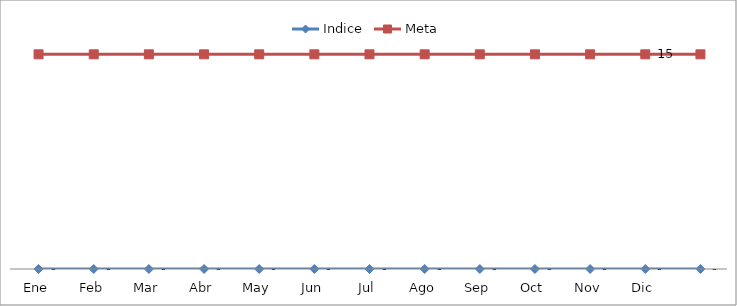
| Category | Indice | Meta |
|---|---|---|
| Ene | 0 | 15 |
| Feb | 0 | 15 |
| Mar | 0 | 15 |
| Abr | 0 | 15 |
| May | 0 | 15 |
| Jun | 0 | 15 |
| Jul | 0 | 15 |
| Ago | 0 | 15 |
| Sep | 0 | 15 |
| Oct | 0 | 15 |
| Nov | 0 | 15 |
| Dic | 0 | 15 |